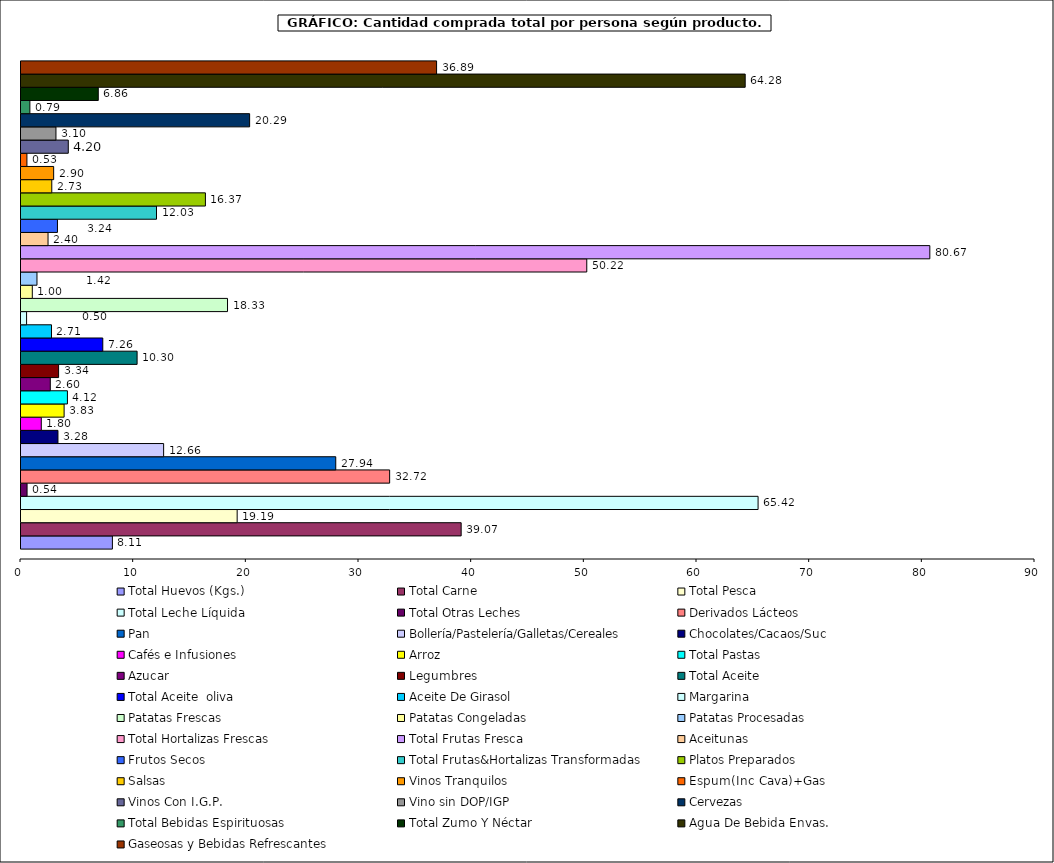
| Category | Total Huevos (Kgs.) | Total Carne | Total Pesca | Total Leche Líquida | Total Otras Leches | Derivados Lácteos | Pan | Bollería/Pastelería/Galletas/Cereales | Chocolates/Cacaos/Suc | Cafés e Infusiones | Arroz | Total Pastas | Azucar | Legumbres | Total Aceite | Total Aceite  oliva | Aceite De Girasol | Margarina | Patatas Frescas | Patatas Congeladas | Patatas Procesadas | Total Hortalizas Frescas | Total Frutas Fresca | Aceitunas | Frutos Secos | Total Frutas&Hortalizas Transformadas | Platos Preparados | Salsas | Vinos Tranquilos | Espum(Inc Cava)+Gas | Vinos Con I.G.P. | Vino sin DOP/IGP | Cervezas | Total Bebidas Espirituosas  | Total Zumo Y Néctar | Agua De Bebida Envas. | Gaseosas y Bebidas Refrescantes |
|---|---|---|---|---|---|---|---|---|---|---|---|---|---|---|---|---|---|---|---|---|---|---|---|---|---|---|---|---|---|---|---|---|---|---|---|---|---|
| 0 | 8.112 | 39.068 | 19.187 | 65.422 | 0.539 | 32.72 | 27.937 | 12.659 | 3.28 | 1.801 | 3.826 | 4.121 | 2.601 | 3.338 | 10.305 | 7.259 | 2.707 | 0.496 | 18.33 | 1.003 | 1.417 | 50.217 | 80.666 | 2.4 | 3.236 | 12.028 | 16.369 | 2.733 | 2.899 | 0.527 | 4.197 | 3.103 | 20.293 | 0.788 | 6.859 | 64.278 | 36.887 |